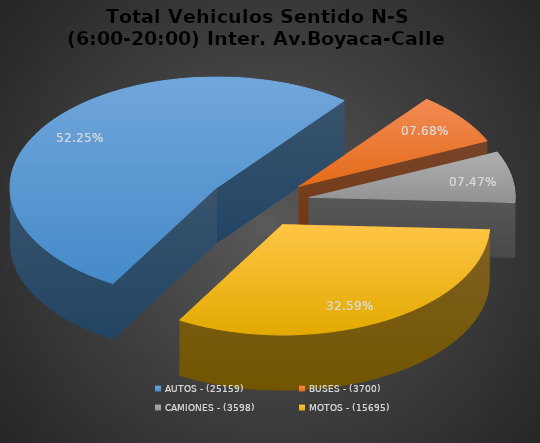
| Category | PORCENTAJE |
|---|---|
| AUTOS - (25159) | 52.249 |
| BUSES - (3700) | 7.684 |
| CAMIONES - (3598) | 7.472 |
| MOTOS - (15695) | 32.595 |